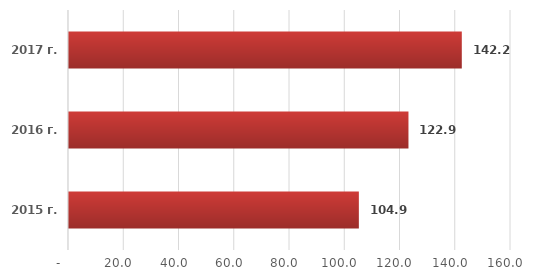
| Category | Series 0 |
|---|---|
| 2015 г. | 104.926 |
| 2016 г. | 122.883 |
| 2017 г. | 142.191 |